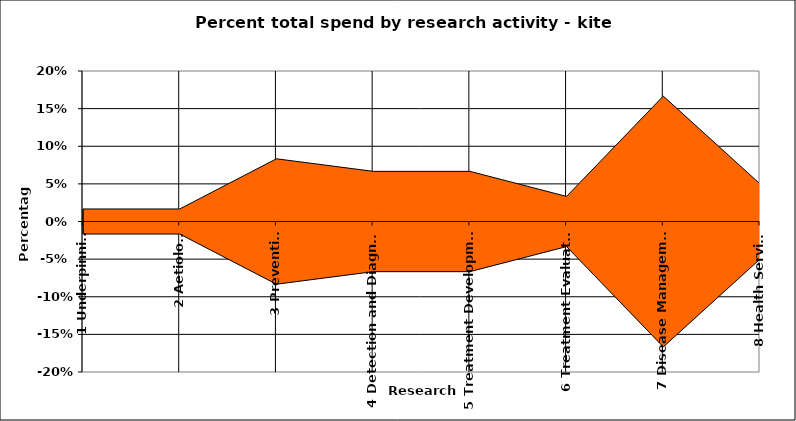
| Category | + | - |
|---|---|---|
| 1 Underpinning | 0.017 | -0.017 |
| 2 Aetiology | 0.017 | -0.017 |
| 3 Prevention | 0.083 | -0.083 |
| 4 Detection and Diagnosis | 0.067 | -0.067 |
| 5 Treatment Development | 0.067 | -0.067 |
| 6 Treatment Evaluation | 0.033 | -0.033 |
| 7 Disease Management | 0.167 | -0.167 |
| 8 Health Services | 0.05 | -0.05 |